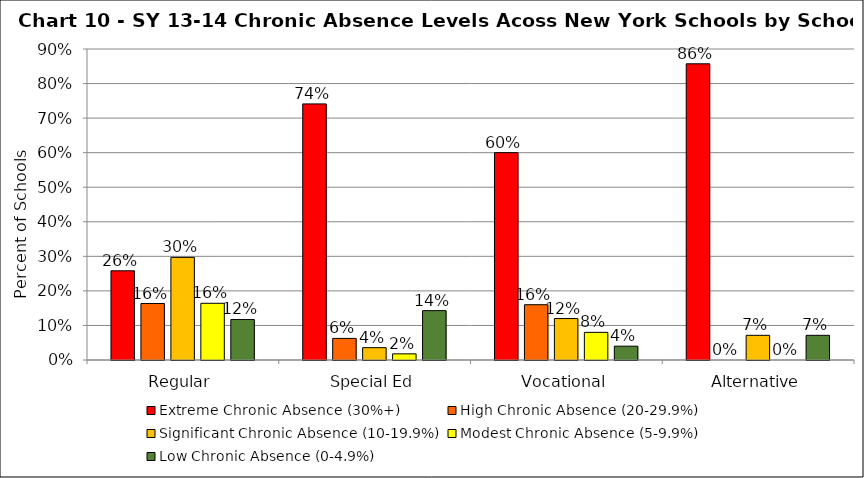
| Category | Extreme Chronic Absence (30%+) | High Chronic Absence (20-29.9%) | Significant Chronic Absence (10-19.9%) | Modest Chronic Absence (5-9.9%) | Low Chronic Absence (0-4.9%) |
|---|---|---|---|---|---|
| 0 | 0.258 | 0.163 | 0.297 | 0.164 | 0.117 |
| 1 | 0.741 | 0.062 | 0.036 | 0.018 | 0.143 |
| 2 | 0.6 | 0.16 | 0.12 | 0.08 | 0.04 |
| 3 | 0.857 | 0 | 0.071 | 0 | 0.071 |